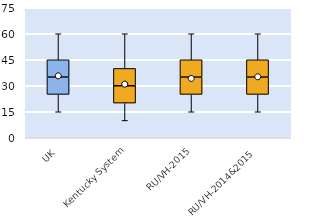
| Category | 25th | 50th | 75th |
|---|---|---|---|
| UK | 25 | 10 | 10 |
| Kentucky System | 20 | 10 | 10 |
| RU/VH-2015 | 25 | 10 | 10 |
| RU/VH-2014&2015 | 25 | 10 | 10 |